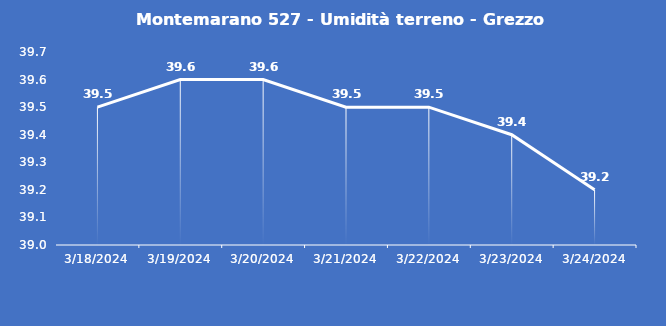
| Category | Montemarano 527 - Umidità terreno - Grezzo (%VWC) |
|---|---|
| 3/18/24 | 39.5 |
| 3/19/24 | 39.6 |
| 3/20/24 | 39.6 |
| 3/21/24 | 39.5 |
| 3/22/24 | 39.5 |
| 3/23/24 | 39.4 |
| 3/24/24 | 39.2 |